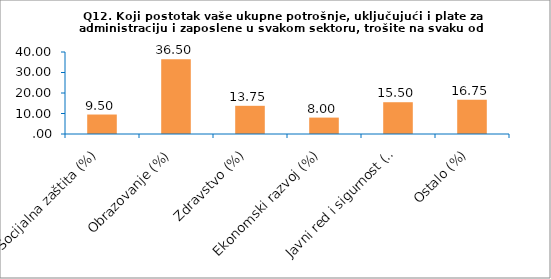
| Category | Series 0 |
|---|---|
| Socijalna zaštita (%) | 9.5 |
| Obrazovanje (%) | 36.5 |
| Zdravstvo (%) | 13.75 |
| Ekonomski razvoj (%) | 8 |
| Javni red i sigurnost (%) | 15.5 |
| Ostalo (%) | 16.75 |